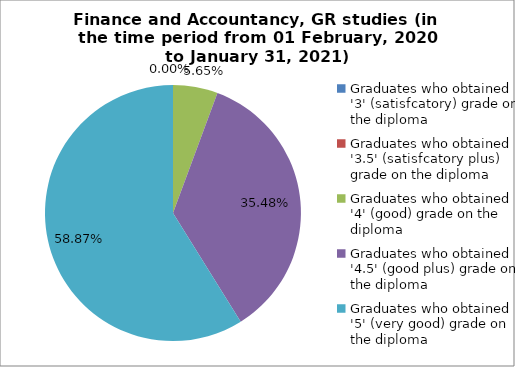
| Category | Series 1 |
|---|---|
| Graduates who obtained '3' (satisfcatory) grade on the diploma | 0 |
| Graduates who obtained '3.5' (satisfcatory plus) grade on the diploma | 0 |
| Graduates who obtained '4' (good) grade on the diploma | 5.645 |
| Graduates who obtained '4.5' (good plus) grade on the diploma | 35.484 |
| Graduates who obtained '5' (very good) grade on the diploma | 58.871 |